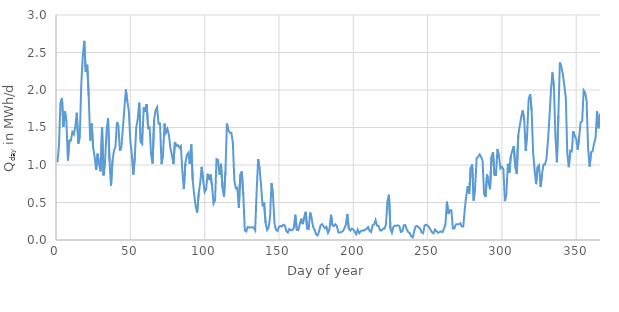
| Category | Series 0 |
|---|---|
| 0 | 1.036 |
| 1 | 1.263 |
| 2 | 1.831 |
| 3 | 1.893 |
| 4 | 1.511 |
| 5 | 1.717 |
| 6 | 1.583 |
| 7 | 1.06 |
| 8 | 1.327 |
| 9 | 1.326 |
| 10 | 1.439 |
| 11 | 1.408 |
| 12 | 1.511 |
| 13 | 1.697 |
| 14 | 1.287 |
| 15 | 1.376 |
| 16 | 2.068 |
| 17 | 2.449 |
| 18 | 2.655 |
| 19 | 2.243 |
| 20 | 2.336 |
| 21 | 1.926 |
| 22 | 1.327 |
| 23 | 1.552 |
| 24 | 1.233 |
| 25 | 1.109 |
| 26 | 0.934 |
| 27 | 1.15 |
| 28 | 1.012 |
| 29 | 0.915 |
| 30 | 1.501 |
| 31 | 0.862 |
| 32 | 1.047 |
| 33 | 1.449 |
| 34 | 1.625 |
| 35 | 1.052 |
| 36 | 0.721 |
| 37 | 1.058 |
| 38 | 1.192 |
| 39 | 1.243 |
| 40 | 1.573 |
| 41 | 1.522 |
| 42 | 1.19 |
| 43 | 1.246 |
| 44 | 1.491 |
| 45 | 1.748 |
| 46 | 2.006 |
| 47 | 1.851 |
| 48 | 1.717 |
| 49 | 1.327 |
| 50 | 1.141 |
| 51 | 0.872 |
| 52 | 1.099 |
| 53 | 1.501 |
| 54 | 1.614 |
| 55 | 1.831 |
| 56 | 1.303 |
| 57 | 1.279 |
| 58 | 1.769 |
| 59 | 1.707 |
| 60 | 1.81 |
| 61 | 1.491 |
| 62 | 1.501 |
| 63 | 1.133 |
| 64 | 1.02 |
| 65 | 1.604 |
| 66 | 1.728 |
| 67 | 1.769 |
| 68 | 1.552 |
| 69 | 1.552 |
| 70 | 1.012 |
| 71 | 1.133 |
| 72 | 1.552 |
| 73 | 1.429 |
| 74 | 1.48 |
| 75 | 1.398 |
| 76 | 1.223 |
| 77 | 1.133 |
| 78 | 1.012 |
| 79 | 1.305 |
| 80 | 1.254 |
| 81 | 1.264 |
| 82 | 1.233 |
| 83 | 1.254 |
| 84 | 0.923 |
| 85 | 0.68 |
| 86 | 1.016 |
| 87 | 1.13 |
| 88 | 1.161 |
| 89 | 1.016 |
| 90 | 1.274 |
| 91 | 0.794 |
| 92 | 0.599 |
| 93 | 0.45 |
| 94 | 0.367 |
| 95 | 0.625 |
| 96 | 0.759 |
| 97 | 0.975 |
| 98 | 0.794 |
| 99 | 0.64 |
| 100 | 0.676 |
| 101 | 0.882 |
| 102 | 0.8 |
| 103 | 0.872 |
| 104 | 0.718 |
| 105 | 0.486 |
| 106 | 0.527 |
| 107 | 1.078 |
| 108 | 1.068 |
| 109 | 0.872 |
| 110 | 1.016 |
| 111 | 0.697 |
| 112 | 0.575 |
| 113 | 0.915 |
| 114 | 1.552 |
| 115 | 1.46 |
| 116 | 1.429 |
| 117 | 1.429 |
| 118 | 1.295 |
| 119 | 0.794 |
| 120 | 0.688 |
| 121 | 0.697 |
| 122 | 0.429 |
| 123 | 0.872 |
| 124 | 0.913 |
| 125 | 0.604 |
| 126 | 0.129 |
| 127 | 0.113 |
| 128 | 0.174 |
| 129 | 0.169 |
| 130 | 0.164 |
| 131 | 0.171 |
| 132 | 0.166 |
| 133 | 0.129 |
| 134 | 0.656 |
| 135 | 1.078 |
| 136 | 0.944 |
| 137 | 0.718 |
| 138 | 0.45 |
| 139 | 0.501 |
| 140 | 0.227 |
| 141 | 0.134 |
| 142 | 0.163 |
| 143 | 0.305 |
| 144 | 0.759 |
| 145 | 0.594 |
| 146 | 0.223 |
| 147 | 0.137 |
| 148 | 0.12 |
| 149 | 0.175 |
| 150 | 0.186 |
| 151 | 0.18 |
| 152 | 0.204 |
| 153 | 0.192 |
| 154 | 0.12 |
| 155 | 0.099 |
| 156 | 0.147 |
| 157 | 0.129 |
| 158 | 0.132 |
| 159 | 0.163 |
| 160 | 0.336 |
| 161 | 0.136 |
| 162 | 0.13 |
| 163 | 0.208 |
| 164 | 0.285 |
| 165 | 0.212 |
| 166 | 0.305 |
| 167 | 0.377 |
| 168 | 0.149 |
| 169 | 0.145 |
| 170 | 0.367 |
| 171 | 0.285 |
| 172 | 0.175 |
| 173 | 0.133 |
| 174 | 0.077 |
| 175 | 0.061 |
| 176 | 0.116 |
| 177 | 0.196 |
| 178 | 0.211 |
| 179 | 0.182 |
| 180 | 0.156 |
| 181 | 0.175 |
| 182 | 0.097 |
| 183 | 0.143 |
| 184 | 0.336 |
| 185 | 0.196 |
| 186 | 0.185 |
| 187 | 0.21 |
| 188 | 0.185 |
| 189 | 0.101 |
| 190 | 0.098 |
| 191 | 0.108 |
| 192 | 0.118 |
| 193 | 0.154 |
| 194 | 0.204 |
| 195 | 0.346 |
| 196 | 0.15 |
| 197 | 0.125 |
| 198 | 0.152 |
| 199 | 0.14 |
| 200 | 0.11 |
| 201 | 0.077 |
| 202 | 0.138 |
| 203 | 0.092 |
| 204 | 0.118 |
| 205 | 0.127 |
| 206 | 0.123 |
| 207 | 0.137 |
| 208 | 0.149 |
| 209 | 0.173 |
| 210 | 0.122 |
| 211 | 0.105 |
| 212 | 0.197 |
| 213 | 0.206 |
| 214 | 0.264 |
| 215 | 0.192 |
| 216 | 0.19 |
| 217 | 0.128 |
| 218 | 0.125 |
| 219 | 0.151 |
| 220 | 0.149 |
| 221 | 0.208 |
| 222 | 0.522 |
| 223 | 0.604 |
| 224 | 0.149 |
| 225 | 0.097 |
| 226 | 0.175 |
| 227 | 0.192 |
| 228 | 0.189 |
| 229 | 0.196 |
| 230 | 0.185 |
| 231 | 0.107 |
| 232 | 0.116 |
| 233 | 0.196 |
| 234 | 0.199 |
| 235 | 0.14 |
| 236 | 0.104 |
| 237 | 0.093 |
| 238 | 0.048 |
| 239 | 0.035 |
| 240 | 0.118 |
| 241 | 0.182 |
| 242 | 0.188 |
| 243 | 0.169 |
| 244 | 0.151 |
| 245 | 0.1 |
| 246 | 0.091 |
| 247 | 0.193 |
| 248 | 0.204 |
| 249 | 0.192 |
| 250 | 0.171 |
| 251 | 0.134 |
| 252 | 0.103 |
| 253 | 0.089 |
| 254 | 0.141 |
| 255 | 0.118 |
| 256 | 0.096 |
| 257 | 0.106 |
| 258 | 0.114 |
| 259 | 0.104 |
| 260 | 0.149 |
| 261 | 0.208 |
| 262 | 0.511 |
| 263 | 0.346 |
| 264 | 0.398 |
| 265 | 0.398 |
| 266 | 0.152 |
| 267 | 0.152 |
| 268 | 0.208 |
| 269 | 0.21 |
| 270 | 0.21 |
| 271 | 0.223 |
| 272 | 0.18 |
| 273 | 0.179 |
| 274 | 0.405 |
| 275 | 0.584 |
| 276 | 0.718 |
| 277 | 0.614 |
| 278 | 0.965 |
| 279 | 1.006 |
| 280 | 0.527 |
| 281 | 0.705 |
| 282 | 1.089 |
| 283 | 1.109 |
| 284 | 1.14 |
| 285 | 1.109 |
| 286 | 1.058 |
| 287 | 0.616 |
| 288 | 0.575 |
| 289 | 0.872 |
| 290 | 0.769 |
| 291 | 0.676 |
| 292 | 1.109 |
| 293 | 1.171 |
| 294 | 0.866 |
| 295 | 0.866 |
| 296 | 1.212 |
| 297 | 1.12 |
| 298 | 0.955 |
| 299 | 0.975 |
| 300 | 0.944 |
| 301 | 0.519 |
| 302 | 0.616 |
| 303 | 1.016 |
| 304 | 0.893 |
| 305 | 1.12 |
| 306 | 1.192 |
| 307 | 1.254 |
| 308 | 0.971 |
| 309 | 0.882 |
| 310 | 1.398 |
| 311 | 1.522 |
| 312 | 1.645 |
| 313 | 1.728 |
| 314 | 1.604 |
| 315 | 1.19 |
| 316 | 1.416 |
| 317 | 1.882 |
| 318 | 1.944 |
| 319 | 1.728 |
| 320 | 1.171 |
| 321 | 0.934 |
| 322 | 0.745 |
| 323 | 0.971 |
| 324 | 0.996 |
| 325 | 0.707 |
| 326 | 0.882 |
| 327 | 1.006 |
| 328 | 1.006 |
| 329 | 1.085 |
| 330 | 1.327 |
| 331 | 1.635 |
| 332 | 1.996 |
| 333 | 2.233 |
| 334 | 2.037 |
| 335 | 1.388 |
| 336 | 1.036 |
| 337 | 1.659 |
| 338 | 2.367 |
| 339 | 2.305 |
| 340 | 2.212 |
| 341 | 2.058 |
| 342 | 1.893 |
| 343 | 1.157 |
| 344 | 0.971 |
| 345 | 1.192 |
| 346 | 1.181 |
| 347 | 1.449 |
| 348 | 1.388 |
| 349 | 1.346 |
| 350 | 1.206 |
| 351 | 1.376 |
| 352 | 1.573 |
| 353 | 1.583 |
| 354 | 1.996 |
| 355 | 1.965 |
| 356 | 1.851 |
| 357 | 1.222 |
| 358 | 0.98 |
| 359 | 1.171 |
| 360 | 1.181 |
| 361 | 1.284 |
| 362 | 1.357 |
| 363 | 1.717 |
| 364 | 1.489 |
| 365 | 1.683 |